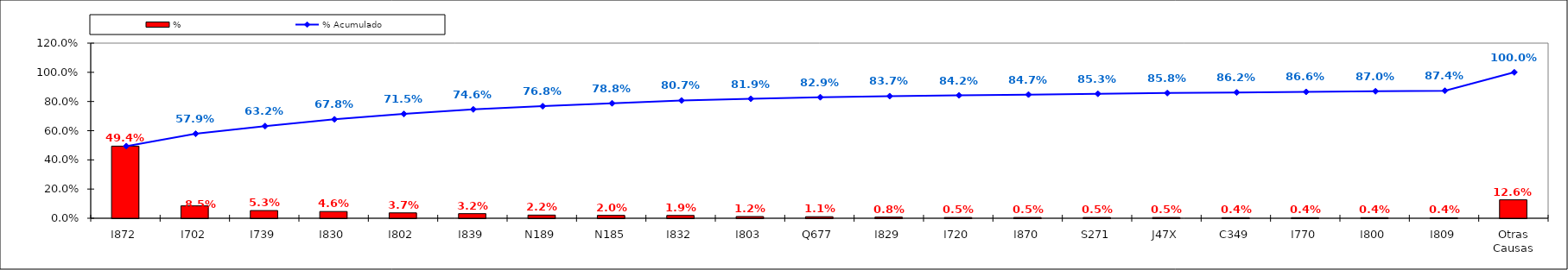
| Category | % |
|---|---|
| I872 | 0.494 |
| I702 | 0.085 |
| I739 | 0.053 |
| I830 | 0.046 |
| I802 | 0.037 |
| I839 | 0.032 |
| N189 | 0.022 |
| N185 | 0.02 |
| I832 | 0.019 |
| I803 | 0.012 |
| Q677 | 0.011 |
| I829 | 0.008 |
| I720 | 0.005 |
| I870 | 0.005 |
| S271 | 0.005 |
| J47X | 0.005 |
| C349 | 0.004 |
| I770 | 0.004 |
| I800 | 0.004 |
| I809 | 0.004 |
| Otras Causas | 0.126 |